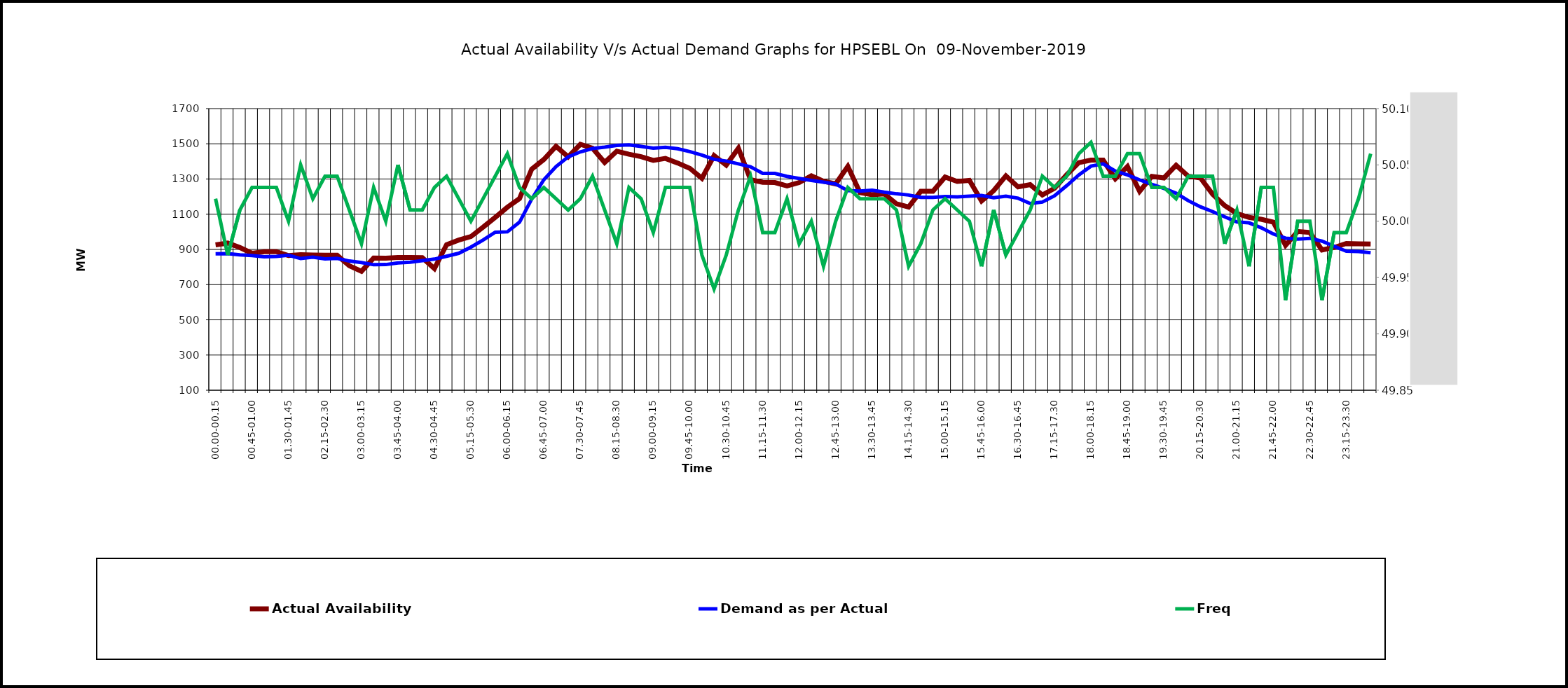
| Category | Actual Availability | Demand as per Actual |
|---|---|---|
| 00.00-00.15 | 926 | 875 |
| 00.15-00.30 | 936 | 876 |
| 00.30-00.45 | 911 | 869 |
| 00.45-01.00 | 878 | 865 |
| 01.00-01.15 | 887 | 858 |
| 01.15-01.30 | 887 | 860 |
| 01.30-01.45 | 865 | 867 |
| 01.45-02:00 | 870 | 848 |
| 02.00-02.15 | 868 | 856 |
| 02.15-02.30 | 867 | 846 |
| 02.30-02.45 | 867 | 849 |
| 02.45-03:00 | 807 | 834 |
| 03.00-03.15 | 776 | 825 |
| 03.15-03.30 | 851 | 813 |
| 03.30-03.45 | 850 | 814 |
| 03.45-04.00 | 854 | 823 |
| 04.00-04.15 | 854 | 827 |
| 04.15-04.30 | 853 | 836 |
| 04.30-04.45 | 791 | 845 |
| 04.45-05.00 | 927 | 861 |
| 05.00-05.15 | 953 | 878 |
| 05.15-05.30 | 973 | 913 |
| 05.30-05.45 | 1026 | 953 |
| 05.45-06.00 | 1082 | 998 |
| 06.00-06.15 | 1140 | 1000 |
| 06.15-06.30 | 1189 | 1055 |
| 06.30-06.45 | 1356 | 1186 |
| 06.45-07.00 | 1411 | 1296 |
| 07.00-07.15 | 1486 | 1370 |
| 07.15-07.30 | 1426 | 1426 |
| 07.30-07.45 | 1497 | 1454 |
| 07.45-08.00 | 1475 | 1473 |
| 08.00-08.15 | 1394 | 1481 |
| 08.15-08.30 | 1458 | 1491 |
| 08.30-08.45 | 1441 | 1494 |
| 08.45-09.00 | 1427 | 1485 |
| 09.00-09.15 | 1406 | 1475 |
| 09.15-09.30 | 1417 | 1480 |
| 09.30-09.45 | 1391 | 1472 |
| 09.45-10.00 | 1361 | 1456 |
| 10.00-10.15 | 1304 | 1436 |
| 10.15-10.30 | 1433 | 1412 |
| 10.30-10.45 | 1379 | 1402 |
| 10.45-11.00 | 1475 | 1386 |
| 11.00-11.15 | 1296 | 1369 |
| 11.15-11.30 | 1281 | 1332 |
| 11.30-11.45 | 1280 | 1332 |
| 11.45-12.00 | 1261 | 1315 |
| 12.00-12.15 | 1280 | 1303 |
| 12.15-12.30 | 1318 | 1292 |
| 12.30-12.45 | 1287 | 1282 |
| 12.45-13.00 | 1272 | 1272 |
| 13.00-13.15 | 1372 | 1234 |
| 13.15-13.30 | 1223 | 1231 |
| 13.30-13.45 | 1211 | 1236 |
| 13.45-14.00 | 1215 | 1225 |
| 14.00-14.15 | 1159 | 1216 |
| 14.15-14.30 | 1141 | 1209 |
| 14.30-14.45 | 1230 | 1196 |
| 14.45-15.00 | 1230 | 1196 |
| 15.00-15.15 | 1311 | 1200 |
| 15.15-15.30 | 1286 | 1199 |
| 15.30-15.45 | 1292 | 1202 |
| 15.45-16.00 | 1175 | 1206 |
| 16.00-16.15 | 1234 | 1194 |
| 16.15-16.30 | 1318 | 1202 |
| 16.30-16.45 | 1255 | 1191 |
| 16.45-17.00 | 1268 | 1161 |
| 17.00-17.15 | 1209 | 1169 |
| 17.15-17.30 | 1247 | 1205 |
| 17.30-17.45 | 1324 | 1262 |
| 17.45-18.00 | 1393 | 1323 |
| 18.00-18.15 | 1407 | 1373 |
| 18.15-18.30 | 1407 | 1386 |
| 18.30-18.45 | 1301 | 1345 |
| 18.45-19.00 | 1371 | 1323 |
| 19.00-19.15 | 1230 | 1295 |
| 19.15-19.30 | 1315 | 1270 |
| 19.30-19.45 | 1306 | 1247 |
| 19.45-20.00 | 1378 | 1219 |
| 20.00-20.15 | 1316 | 1177 |
| 20.15-20.30 | 1306 | 1142 |
| 20.30-20.45 | 1214 | 1115 |
| 20.45-21.00 | 1149 | 1085 |
| 21.00-21.15 | 1104 | 1056 |
| 21.15-21.30 | 1082 | 1051 |
| 21.30-21.45 | 1071 | 1023 |
| 21.45-22.00 | 1055 | 988 |
| 22.00-22.15 | 923 | 964 |
| 22.15-22.30 | 1002 | 959 |
| 22.30-22.45 | 996 | 963 |
| 22.45-23.00 | 897 | 947 |
| 23.00-23.15 | 911 | 918 |
| 23.15-23.30 | 934 | 890 |
| 23.30-23.45 | 932 | 888 |
| 23.45-24.00 | 931 | 881 |